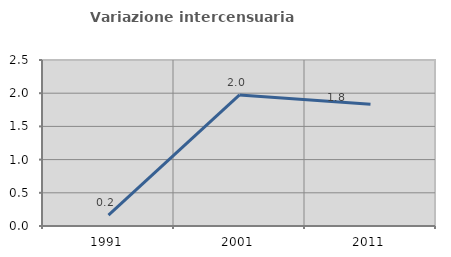
| Category | Variazione intercensuaria annua |
|---|---|
| 1991.0 | 0.162 |
| 2001.0 | 1.974 |
| 2011.0 | 1.834 |